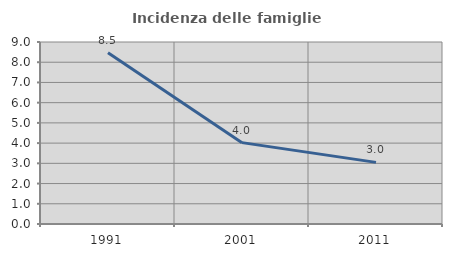
| Category | Incidenza delle famiglie numerose |
|---|---|
| 1991.0 | 8.473 |
| 2001.0 | 4.024 |
| 2011.0 | 3.048 |